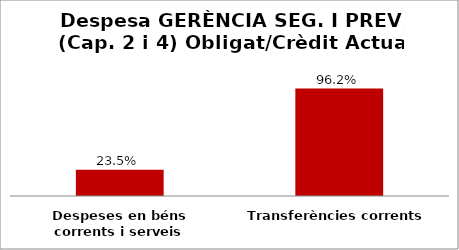
| Category | Series 0 |
|---|---|
| Despeses en béns corrents i serveis | 0.235 |
| Transferències corrents | 0.962 |